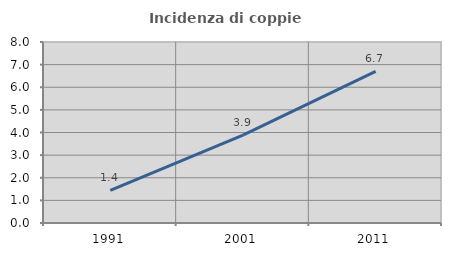
| Category | Incidenza di coppie miste |
|---|---|
| 1991.0 | 1.445 |
| 2001.0 | 3.886 |
| 2011.0 | 6.702 |